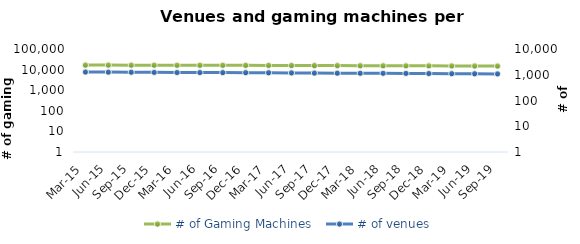
| Category | # of Gaming Machines  |
|---|---|
| Mar-15 | 16614 |
| Jun-15 | 16579 |
| Sep-15 | 16440 |
| Dec-15 | 16393 |
| Mar-16 | 16274 |
| Jun-16 | 16250 |
| Sep-16 | 16221 |
| Dec-16 | 16148 |
| Mar-17 | 16031 |
| Jun-17 | 15858 |
| Sep-17 | 15717 |
| Dec-17 | 15632 |
| Mar-18 | 15490 |
| Jun-18 | 15420 |
| Sep-18 | 15342 |
| Dec-18 | 15257 |
| Mar-19 | 15118 |
| Jun-19 | 15007 |
| Sep-19 | 14894 |